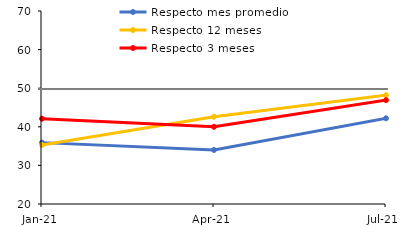
| Category | Respecto mes promedio | Respecto 12 meses | Respecto 3 meses |
|---|---|---|---|
| 2021-01-01 | 35.9 | 35.3 | 42.1 |
| 2021-04-01 | 34 | 42.6 | 40 |
| 2021-07-01 | 42.2 | 48.2 | 46.9 |